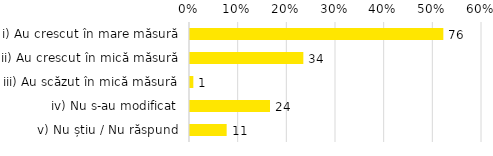
| Category | Total |
|---|---|
| i) Au crescut în mare măsură | 0.521 |
| ii) Au crescut în mică măsură | 0.233 |
| iii) Au scăzut în mică măsură | 0.007 |
| iv) Nu s-au modificat | 0.164 |
| v) Nu știu / Nu răspund | 0.075 |